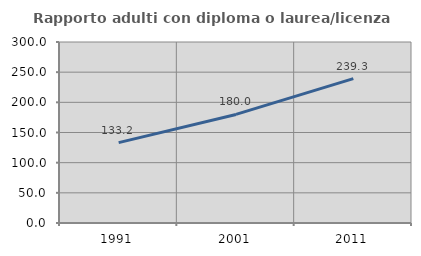
| Category | Rapporto adulti con diploma o laurea/licenza media  |
|---|---|
| 1991.0 | 133.151 |
| 2001.0 | 179.97 |
| 2011.0 | 239.313 |